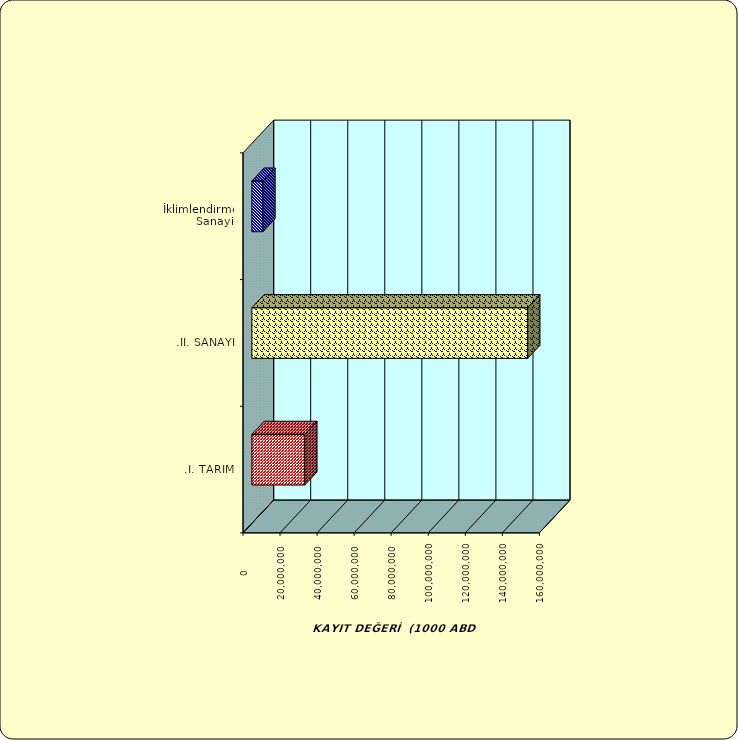
| Category | Series 0 |
|---|---|
| .I. TARIM | 28566519.013 |
| .II. SANAYİ | 148928518 |
|  İklimlendirme Sanayii | 5969527.204 |